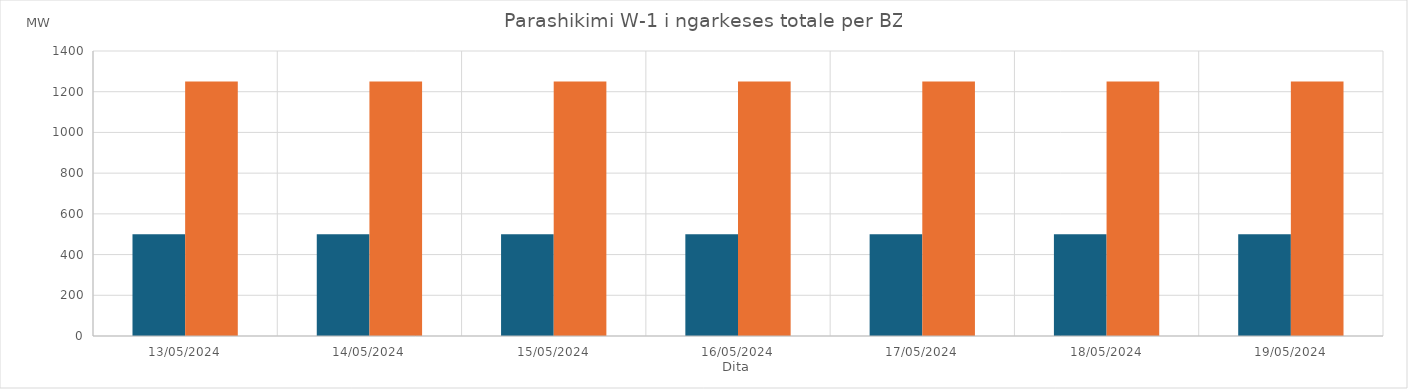
| Category | Min (MW) | Max (MW) |
|---|---|---|
| 13/05/2024 | 500 | 1250 |
| 14/05/2024 | 500 | 1250 |
| 15/05/2024 | 500 | 1250 |
| 16/05/2024 | 500 | 1250 |
| 17/05/2024 | 500 | 1250 |
| 18/05/2024 | 500 | 1250 |
| 19/05/2024 | 500 | 1250 |